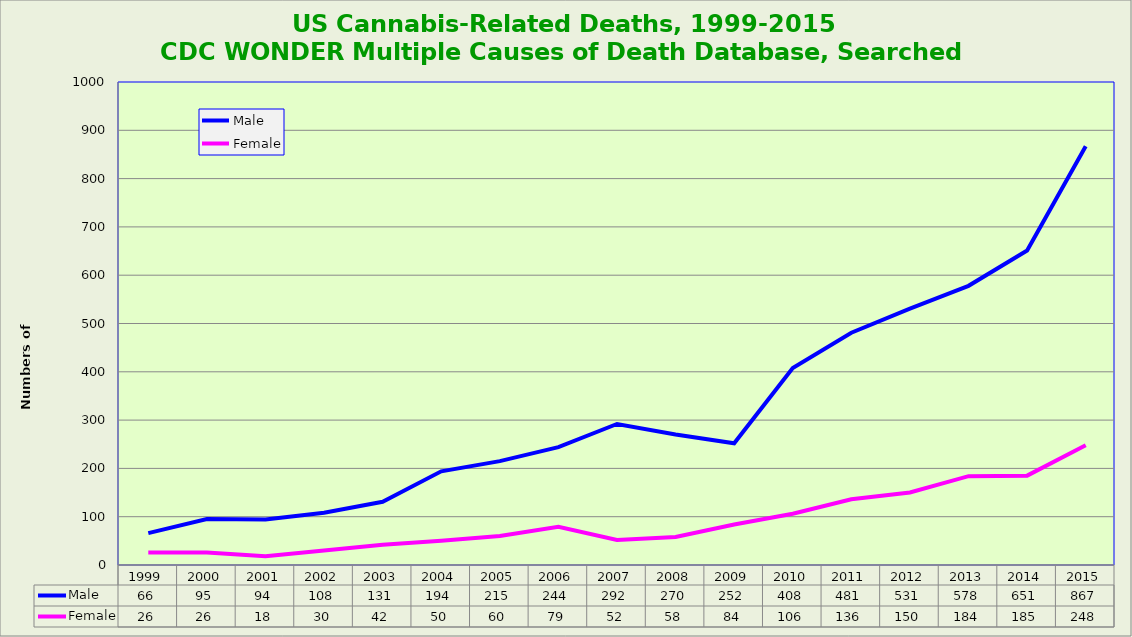
| Category | Male | Female |
|---|---|---|
| 1999.0 | 66 | 26 |
| 2000.0 | 95 | 26 |
| 2001.0 | 94 | 18 |
| 2002.0 | 108 | 30 |
| 2003.0 | 131 | 42 |
| 2004.0 | 194 | 50 |
| 2005.0 | 215 | 60 |
| 2006.0 | 244 | 79 |
| 2007.0 | 292 | 52 |
| 2008.0 | 270 | 58 |
| 2009.0 | 252 | 84 |
| 2010.0 | 408 | 106 |
| 2011.0 | 481 | 136 |
| 2012.0 | 531 | 150 |
| 2013.0 | 578 | 184 |
| 2014.0 | 651 | 185 |
| 2015.0 | 867 | 248 |